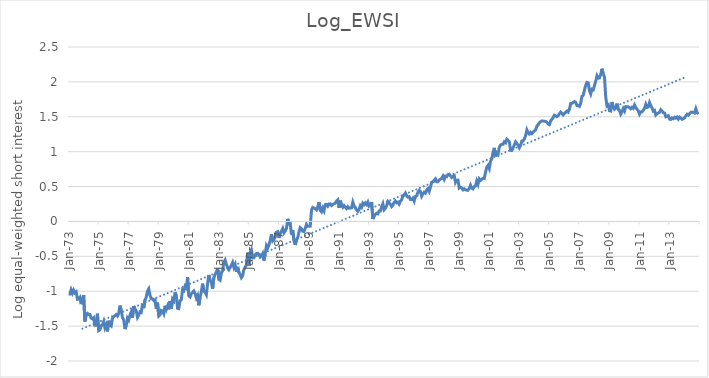
| Category | log_EWSI |
|---|---|
| 1973-01-01 | -1.039 |
| 1973-02-01 | -1.04 |
| 1973-03-01 | -0.98 |
| 1973-04-01 | -1.029 |
| 1973-05-01 | -0.985 |
| 1973-06-01 | -1.023 |
| 1973-07-01 | -1.008 |
| 1973-08-01 | -1.115 |
| 1973-09-01 | -1.112 |
| 1973-10-01 | -1.088 |
| 1973-11-01 | -1.186 |
| 1973-12-01 | -1.113 |
| 1974-01-01 | -1.055 |
| 1974-02-01 | -1.433 |
| 1974-03-01 | -1.336 |
| 1974-04-01 | -1.316 |
| 1974-05-01 | -1.332 |
| 1974-06-01 | -1.333 |
| 1974-07-01 | -1.386 |
| 1974-08-01 | -1.397 |
| 1974-09-01 | -1.38 |
| 1974-10-01 | -1.504 |
| 1974-11-01 | -1.447 |
| 1974-12-01 | -1.322 |
| 1975-01-01 | -1.564 |
| 1975-02-01 | -1.553 |
| 1975-03-01 | -1.494 |
| 1975-04-01 | -1.482 |
| 1975-05-01 | -1.433 |
| 1975-06-01 | -1.525 |
| 1975-07-01 | -1.484 |
| 1975-08-01 | -1.576 |
| 1975-09-01 | -1.423 |
| 1975-10-01 | -1.485 |
| 1975-11-01 | -1.499 |
| 1975-12-01 | -1.388 |
| 1976-01-01 | -1.366 |
| 1976-02-01 | -1.351 |
| 1976-03-01 | -1.335 |
| 1976-04-01 | -1.356 |
| 1976-05-01 | -1.318 |
| 1976-06-01 | -1.206 |
| 1976-07-01 | -1.269 |
| 1976-08-01 | -1.379 |
| 1976-09-01 | -1.412 |
| 1976-10-01 | -1.542 |
| 1976-11-01 | -1.491 |
| 1976-12-01 | -1.386 |
| 1977-01-01 | -1.413 |
| 1977-02-01 | -1.342 |
| 1977-03-01 | -1.299 |
| 1977-04-01 | -1.38 |
| 1977-05-01 | -1.212 |
| 1977-06-01 | -1.254 |
| 1977-07-01 | -1.281 |
| 1977-08-01 | -1.375 |
| 1977-09-01 | -1.342 |
| 1977-10-01 | -1.296 |
| 1977-11-01 | -1.304 |
| 1977-12-01 | -1.188 |
| 1978-01-01 | -1.242 |
| 1978-02-01 | -1.124 |
| 1978-03-01 | -1.086 |
| 1978-04-01 | -0.999 |
| 1978-05-01 | -0.967 |
| 1978-06-01 | -1.058 |
| 1978-07-01 | -1.108 |
| 1978-08-01 | -1.108 |
| 1978-09-01 | -1.133 |
| 1978-10-01 | -1.124 |
| 1978-11-01 | -1.253 |
| 1978-12-01 | -1.163 |
| 1979-01-01 | -1.355 |
| 1979-02-01 | -1.338 |
| 1979-03-01 | -1.276 |
| 1979-04-01 | -1.285 |
| 1979-05-01 | -1.322 |
| 1979-06-01 | -1.208 |
| 1979-07-01 | -1.262 |
| 1979-08-01 | -1.211 |
| 1979-09-01 | -1.26 |
| 1979-10-01 | -1.141 |
| 1979-11-01 | -1.254 |
| 1979-12-01 | -1.112 |
| 1980-01-01 | -1.136 |
| 1980-02-01 | -1.016 |
| 1980-03-01 | -1.061 |
| 1980-04-01 | -1.245 |
| 1980-05-01 | -1.25 |
| 1980-06-01 | -1.136 |
| 1980-07-01 | -1.121 |
| 1980-08-01 | -0.979 |
| 1980-09-01 | -0.993 |
| 1980-10-01 | -0.928 |
| 1980-11-01 | -0.953 |
| 1980-12-01 | -0.798 |
| 1981-01-01 | -1.066 |
| 1981-02-01 | -1.082 |
| 1981-03-01 | -1.037 |
| 1981-04-01 | -1.015 |
| 1981-05-01 | -0.996 |
| 1981-06-01 | -1.032 |
| 1981-07-01 | -1.097 |
| 1981-08-01 | -1.062 |
| 1981-09-01 | -1.201 |
| 1981-10-01 | -1.086 |
| 1981-11-01 | -1.007 |
| 1981-12-01 | -0.891 |
| 1982-01-01 | -1.001 |
| 1982-02-01 | -1.014 |
| 1982-03-01 | -1.049 |
| 1982-04-01 | -0.89 |
| 1982-05-01 | -0.767 |
| 1982-06-01 | -0.839 |
| 1982-07-01 | -0.876 |
| 1982-08-01 | -0.964 |
| 1982-09-01 | -0.806 |
| 1982-10-01 | -0.76 |
| 1982-11-01 | -0.725 |
| 1982-12-01 | -0.67 |
| 1983-01-01 | -0.829 |
| 1983-02-01 | -0.843 |
| 1983-03-01 | -0.739 |
| 1983-04-01 | -0.708 |
| 1983-05-01 | -0.585 |
| 1983-06-01 | -0.553 |
| 1983-07-01 | -0.613 |
| 1983-08-01 | -0.663 |
| 1983-09-01 | -0.692 |
| 1983-10-01 | -0.659 |
| 1983-11-01 | -0.63 |
| 1983-12-01 | -0.588 |
| 1984-01-01 | -0.658 |
| 1984-02-01 | -0.617 |
| 1984-03-01 | -0.724 |
| 1984-04-01 | -0.651 |
| 1984-05-01 | -0.731 |
| 1984-06-01 | -0.761 |
| 1984-07-01 | -0.806 |
| 1984-08-01 | -0.778 |
| 1984-09-01 | -0.69 |
| 1984-10-01 | -0.657 |
| 1984-11-01 | -0.622 |
| 1984-12-01 | -0.448 |
| 1985-01-01 | -0.636 |
| 1985-02-01 | -0.448 |
| 1985-03-01 | -0.407 |
| 1985-04-01 | -0.521 |
| 1985-05-01 | -0.52 |
| 1985-06-01 | -0.476 |
| 1985-07-01 | -0.461 |
| 1985-08-01 | -0.456 |
| 1985-09-01 | -0.472 |
| 1985-10-01 | -0.51 |
| 1985-11-01 | -0.497 |
| 1985-12-01 | -0.462 |
| 1986-01-01 | -0.561 |
| 1986-02-01 | -0.469 |
| 1986-03-01 | -0.346 |
| 1986-04-01 | -0.379 |
| 1986-05-01 | -0.337 |
| 1986-06-01 | -0.271 |
| 1986-07-01 | -0.183 |
| 1986-08-01 | -0.28 |
| 1986-09-01 | -0.26 |
| 1986-10-01 | -0.221 |
| 1986-11-01 | -0.157 |
| 1986-12-01 | -0.148 |
| 1987-01-01 | -0.236 |
| 1987-02-01 | -0.169 |
| 1987-03-01 | -0.139 |
| 1987-04-01 | -0.101 |
| 1987-05-01 | -0.164 |
| 1987-06-01 | -0.137 |
| 1987-07-01 | -0.099 |
| 1987-08-01 | 0.037 |
| 1987-09-01 | -0.032 |
| 1987-10-01 | -0.023 |
| 1987-11-01 | -0.187 |
| 1987-12-01 | -0.124 |
| 1988-01-01 | -0.276 |
| 1988-02-01 | -0.337 |
| 1988-03-01 | -0.262 |
| 1988-04-01 | -0.231 |
| 1988-05-01 | -0.151 |
| 1988-06-01 | -0.089 |
| 1988-07-01 | -0.105 |
| 1988-08-01 | -0.141 |
| 1988-09-01 | -0.146 |
| 1988-10-01 | -0.099 |
| 1988-11-01 | -0.04 |
| 1988-12-01 | -0.067 |
| 1989-01-01 | -0.068 |
| 1989-02-01 | -0.067 |
| 1989-03-01 | 0.165 |
| 1989-04-01 | 0.201 |
| 1989-05-01 | 0.191 |
| 1989-06-01 | 0.183 |
| 1989-07-01 | 0.166 |
| 1989-08-01 | 0.209 |
| 1989-09-01 | 0.276 |
| 1989-10-01 | 0.158 |
| 1989-11-01 | 0.137 |
| 1989-12-01 | 0.191 |
| 1990-01-01 | 0.152 |
| 1990-02-01 | 0.24 |
| 1990-03-01 | 0.245 |
| 1990-04-01 | 0.219 |
| 1990-05-01 | 0.251 |
| 1990-06-01 | 0.252 |
| 1990-07-01 | 0.228 |
| 1990-08-01 | 0.245 |
| 1990-09-01 | 0.253 |
| 1990-10-01 | 0.263 |
| 1990-11-01 | 0.293 |
| 1990-12-01 | 0.31 |
| 1991-01-01 | 0.194 |
| 1991-02-01 | 0.298 |
| 1991-03-01 | 0.229 |
| 1991-04-01 | 0.203 |
| 1991-05-01 | 0.227 |
| 1991-06-01 | 0.204 |
| 1991-07-01 | 0.184 |
| 1991-08-01 | 0.211 |
| 1991-09-01 | 0.19 |
| 1991-10-01 | 0.192 |
| 1991-11-01 | 0.195 |
| 1991-12-01 | 0.276 |
| 1992-01-01 | 0.222 |
| 1992-02-01 | 0.201 |
| 1992-03-01 | 0.165 |
| 1992-04-01 | 0.145 |
| 1992-05-01 | 0.172 |
| 1992-06-01 | 0.226 |
| 1992-07-01 | 0.203 |
| 1992-08-01 | 0.262 |
| 1992-09-01 | 0.241 |
| 1992-10-01 | 0.266 |
| 1992-11-01 | 0.242 |
| 1992-12-01 | 0.277 |
| 1993-01-01 | 0.22 |
| 1993-02-01 | 0.232 |
| 1993-03-01 | 0.277 |
| 1993-04-01 | 0.035 |
| 1993-05-01 | 0.074 |
| 1993-06-01 | 0.102 |
| 1993-07-01 | 0.118 |
| 1993-08-01 | 0.11 |
| 1993-09-01 | 0.15 |
| 1993-10-01 | 0.148 |
| 1993-11-01 | 0.21 |
| 1993-12-01 | 0.253 |
| 1994-01-01 | 0.167 |
| 1994-02-01 | 0.188 |
| 1994-03-01 | 0.225 |
| 1994-04-01 | 0.287 |
| 1994-05-01 | 0.27 |
| 1994-06-01 | 0.245 |
| 1994-07-01 | 0.213 |
| 1994-08-01 | 0.234 |
| 1994-09-01 | 0.273 |
| 1994-10-01 | 0.291 |
| 1994-11-01 | 0.268 |
| 1994-12-01 | 0.277 |
| 1995-01-01 | 0.249 |
| 1995-02-01 | 0.291 |
| 1995-03-01 | 0.312 |
| 1995-04-01 | 0.367 |
| 1995-05-01 | 0.379 |
| 1995-06-01 | 0.407 |
| 1995-07-01 | 0.368 |
| 1995-08-01 | 0.349 |
| 1995-09-01 | 0.354 |
| 1995-10-01 | 0.315 |
| 1995-11-01 | 0.314 |
| 1995-12-01 | 0.334 |
| 1996-01-01 | 0.291 |
| 1996-02-01 | 0.358 |
| 1996-03-01 | 0.368 |
| 1996-04-01 | 0.418 |
| 1996-05-01 | 0.445 |
| 1996-06-01 | 0.429 |
| 1996-07-01 | 0.362 |
| 1996-08-01 | 0.395 |
| 1996-09-01 | 0.419 |
| 1996-10-01 | 0.406 |
| 1996-11-01 | 0.452 |
| 1996-12-01 | 0.47 |
| 1997-01-01 | 0.432 |
| 1997-02-01 | 0.491 |
| 1997-03-01 | 0.561 |
| 1997-04-01 | 0.568 |
| 1997-05-01 | 0.592 |
| 1997-06-01 | 0.611 |
| 1997-07-01 | 0.569 |
| 1997-08-01 | 0.568 |
| 1997-09-01 | 0.594 |
| 1997-10-01 | 0.607 |
| 1997-11-01 | 0.618 |
| 1997-12-01 | 0.65 |
| 1998-01-01 | 0.604 |
| 1998-02-01 | 0.649 |
| 1998-03-01 | 0.642 |
| 1998-04-01 | 0.671 |
| 1998-05-01 | 0.677 |
| 1998-06-01 | 0.653 |
| 1998-07-01 | 0.631 |
| 1998-08-01 | 0.645 |
| 1998-09-01 | 0.657 |
| 1998-10-01 | 0.56 |
| 1998-11-01 | 0.591 |
| 1998-12-01 | 0.592 |
| 1999-01-01 | 0.478 |
| 1999-02-01 | 0.488 |
| 1999-03-01 | 0.481 |
| 1999-04-01 | 0.453 |
| 1999-05-01 | 0.468 |
| 1999-06-01 | 0.454 |
| 1999-07-01 | 0.447 |
| 1999-08-01 | 0.447 |
| 1999-09-01 | 0.475 |
| 1999-10-01 | 0.52 |
| 1999-11-01 | 0.476 |
| 1999-12-01 | 0.467 |
| 2000-01-01 | 0.499 |
| 2000-02-01 | 0.508 |
| 2000-03-01 | 0.581 |
| 2000-04-01 | 0.534 |
| 2000-05-01 | 0.61 |
| 2000-06-01 | 0.588 |
| 2000-07-01 | 0.603 |
| 2000-08-01 | 0.619 |
| 2000-09-01 | 0.617 |
| 2000-10-01 | 0.707 |
| 2000-11-01 | 0.779 |
| 2000-12-01 | 0.804 |
| 2001-01-01 | 0.759 |
| 2001-02-01 | 0.864 |
| 2001-03-01 | 0.899 |
| 2001-04-01 | 0.99 |
| 2001-05-01 | 1.054 |
| 2001-06-01 | 0.931 |
| 2001-07-01 | 0.981 |
| 2001-08-01 | 0.96 |
| 2001-09-01 | 1.063 |
| 2001-10-01 | 1.095 |
| 2001-11-01 | 1.106 |
| 2001-12-01 | 1.106 |
| 2002-01-01 | 1.142 |
| 2002-02-01 | 1.128 |
| 2002-03-01 | 1.179 |
| 2002-04-01 | 1.161 |
| 2002-05-01 | 1.142 |
| 2002-06-01 | 1.02 |
| 2002-07-01 | 1.017 |
| 2002-08-01 | 1.055 |
| 2002-09-01 | 1.096 |
| 2002-10-01 | 1.14 |
| 2002-11-01 | 1.117 |
| 2002-12-01 | 1.093 |
| 2003-01-01 | 1.056 |
| 2003-02-01 | 1.092 |
| 2003-03-01 | 1.154 |
| 2003-04-01 | 1.154 |
| 2003-05-01 | 1.182 |
| 2003-06-01 | 1.23 |
| 2003-07-01 | 1.312 |
| 2003-08-01 | 1.272 |
| 2003-09-01 | 1.252 |
| 2003-10-01 | 1.276 |
| 2003-11-01 | 1.258 |
| 2003-12-01 | 1.278 |
| 2004-01-01 | 1.297 |
| 2004-02-01 | 1.312 |
| 2004-03-01 | 1.367 |
| 2004-04-01 | 1.384 |
| 2004-05-01 | 1.416 |
| 2004-06-01 | 1.43 |
| 2004-07-01 | 1.442 |
| 2004-08-01 | 1.438 |
| 2004-09-01 | 1.436 |
| 2004-10-01 | 1.433 |
| 2004-11-01 | 1.421 |
| 2004-12-01 | 1.398 |
| 2005-01-01 | 1.387 |
| 2005-02-01 | 1.439 |
| 2005-03-01 | 1.465 |
| 2005-04-01 | 1.488 |
| 2005-05-01 | 1.523 |
| 2005-06-01 | 1.514 |
| 2005-07-01 | 1.502 |
| 2005-08-01 | 1.515 |
| 2005-09-01 | 1.544 |
| 2005-10-01 | 1.567 |
| 2005-11-01 | 1.547 |
| 2005-12-01 | 1.526 |
| 2006-01-01 | 1.549 |
| 2006-02-01 | 1.564 |
| 2006-03-01 | 1.582 |
| 2006-04-01 | 1.568 |
| 2006-05-01 | 1.609 |
| 2006-06-01 | 1.69 |
| 2006-07-01 | 1.692 |
| 2006-08-01 | 1.705 |
| 2006-09-01 | 1.718 |
| 2006-10-01 | 1.707 |
| 2006-11-01 | 1.661 |
| 2006-12-01 | 1.662 |
| 2007-01-01 | 1.65 |
| 2007-02-01 | 1.694 |
| 2007-03-01 | 1.792 |
| 2007-04-01 | 1.807 |
| 2007-05-01 | 1.881 |
| 2007-06-01 | 1.953 |
| 2007-07-01 | 1.992 |
| 2007-08-01 | 1.986 |
| 2007-09-01 | 1.874 |
| 2007-10-01 | 1.827 |
| 2007-11-01 | 1.894 |
| 2007-12-01 | 1.885 |
| 2008-01-01 | 1.948 |
| 2008-02-01 | 2.01 |
| 2008-03-01 | 2.088 |
| 2008-04-01 | 2.053 |
| 2008-05-01 | 2.056 |
| 2008-06-01 | 2.107 |
| 2008-07-01 | 2.189 |
| 2008-08-01 | 2.115 |
| 2008-09-01 | 2.069 |
| 2008-10-01 | 1.781 |
| 2008-11-01 | 1.657 |
| 2008-12-01 | 1.672 |
| 2009-01-01 | 1.587 |
| 2009-02-01 | 1.582 |
| 2009-03-01 | 1.711 |
| 2009-04-01 | 1.637 |
| 2009-05-01 | 1.608 |
| 2009-06-01 | 1.625 |
| 2009-07-01 | 1.689 |
| 2009-08-01 | 1.606 |
| 2009-09-01 | 1.593 |
| 2009-10-01 | 1.539 |
| 2009-11-01 | 1.574 |
| 2009-12-01 | 1.618 |
| 2010-01-01 | 1.583 |
| 2010-02-01 | 1.646 |
| 2010-03-01 | 1.644 |
| 2010-04-01 | 1.645 |
| 2010-05-01 | 1.629 |
| 2010-06-01 | 1.615 |
| 2010-07-01 | 1.636 |
| 2010-08-01 | 1.622 |
| 2010-09-01 | 1.67 |
| 2010-10-01 | 1.635 |
| 2010-11-01 | 1.607 |
| 2010-12-01 | 1.586 |
| 2011-01-01 | 1.538 |
| 2011-02-01 | 1.569 |
| 2011-03-01 | 1.57 |
| 2011-04-01 | 1.594 |
| 2011-05-01 | 1.621 |
| 2011-06-01 | 1.678 |
| 2011-07-01 | 1.634 |
| 2011-08-01 | 1.641 |
| 2011-09-01 | 1.705 |
| 2011-10-01 | 1.662 |
| 2011-11-01 | 1.628 |
| 2011-12-01 | 1.581 |
| 2012-01-01 | 1.591 |
| 2012-02-01 | 1.526 |
| 2012-03-01 | 1.545 |
| 2012-04-01 | 1.553 |
| 2012-05-01 | 1.564 |
| 2012-06-01 | 1.602 |
| 2012-07-01 | 1.583 |
| 2012-08-01 | 1.558 |
| 2012-09-01 | 1.553 |
| 2012-10-01 | 1.5 |
| 2012-11-01 | 1.507 |
| 2012-12-01 | 1.516 |
| 2013-01-01 | 1.466 |
| 2013-02-01 | 1.462 |
| 2013-03-01 | 1.483 |
| 2013-04-01 | 1.472 |
| 2013-05-01 | 1.492 |
| 2013-06-01 | 1.481 |
| 2013-07-01 | 1.496 |
| 2013-08-01 | 1.466 |
| 2013-09-01 | 1.495 |
| 2013-10-01 | 1.483 |
| 2013-11-01 | 1.464 |
| 2013-12-01 | 1.472 |
| 2014-01-01 | 1.484 |
| 2014-02-01 | 1.515 |
| 2014-03-01 | 1.536 |
| 2014-04-01 | 1.523 |
| 2014-05-01 | 1.546 |
| 2014-06-01 | 1.565 |
| 2014-07-01 | 1.564 |
| 2014-08-01 | 1.566 |
| 2014-09-01 | 1.555 |
| 2014-10-01 | 1.615 |
| 2014-11-01 | 1.559 |
| 2014-12-01 | 1.538 |